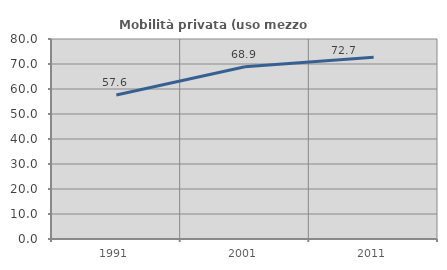
| Category | Mobilità privata (uso mezzo privato) |
|---|---|
| 1991.0 | 57.594 |
| 2001.0 | 68.871 |
| 2011.0 | 72.662 |